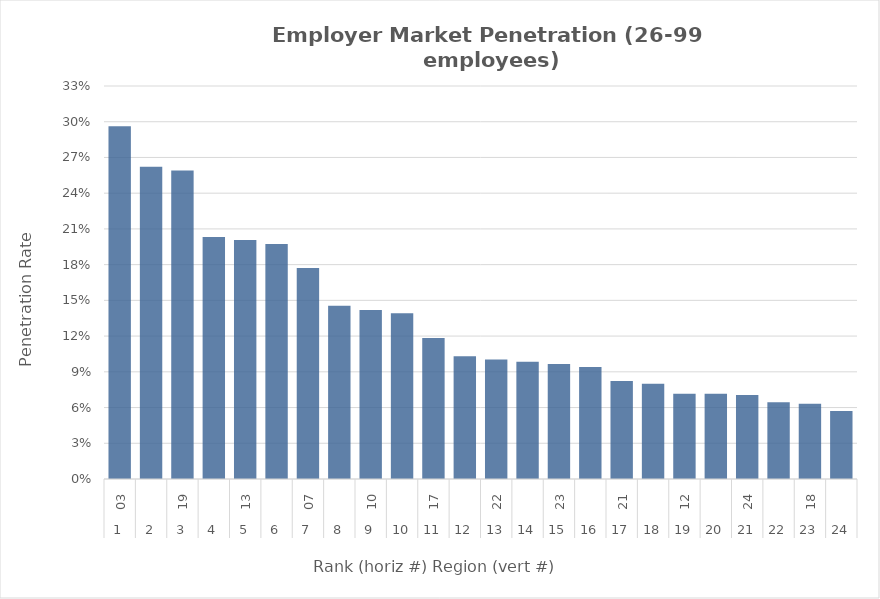
| Category | Rate |
|---|---|
| 0 | 0.296 |
| 1 | 0.262 |
| 2 | 0.259 |
| 3 | 0.203 |
| 4 | 0.201 |
| 5 | 0.197 |
| 6 | 0.177 |
| 7 | 0.145 |
| 8 | 0.142 |
| 9 | 0.139 |
| 10 | 0.118 |
| 11 | 0.103 |
| 12 | 0.1 |
| 13 | 0.098 |
| 14 | 0.096 |
| 15 | 0.094 |
| 16 | 0.082 |
| 17 | 0.08 |
| 18 | 0.072 |
| 19 | 0.072 |
| 20 | 0.071 |
| 21 | 0.064 |
| 22 | 0.063 |
| 23 | 0.057 |